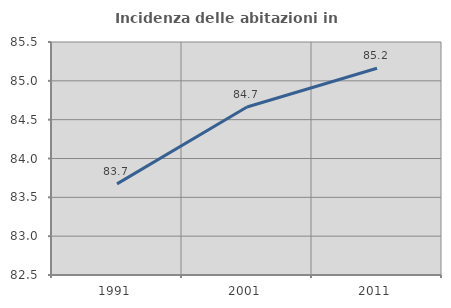
| Category | Incidenza delle abitazioni in proprietà  |
|---|---|
| 1991.0 | 83.673 |
| 2001.0 | 84.663 |
| 2011.0 | 85.161 |